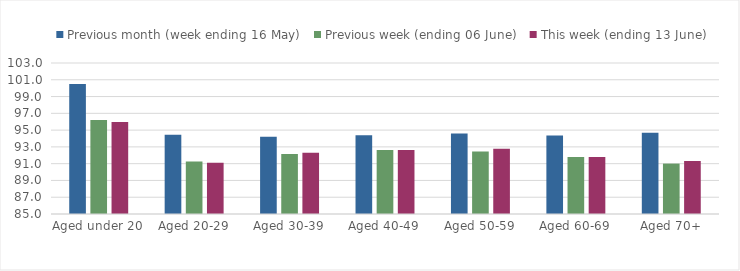
| Category | Previous month (week ending 16 May) | Previous week (ending 06 June) | This week (ending 13 June) |
|---|---|---|---|
| Aged under 20 | 100.505 | 96.215 | 95.98 |
| Aged 20-29 | 94.433 | 91.249 | 91.115 |
| Aged 30-39 | 94.214 | 92.163 | 92.288 |
| Aged 40-49 | 94.377 | 92.637 | 92.644 |
| Aged 50-59 | 94.593 | 92.436 | 92.765 |
| Aged 60-69 | 94.368 | 91.801 | 91.782 |
| Aged 70+ | 94.675 | 91.008 | 91.315 |